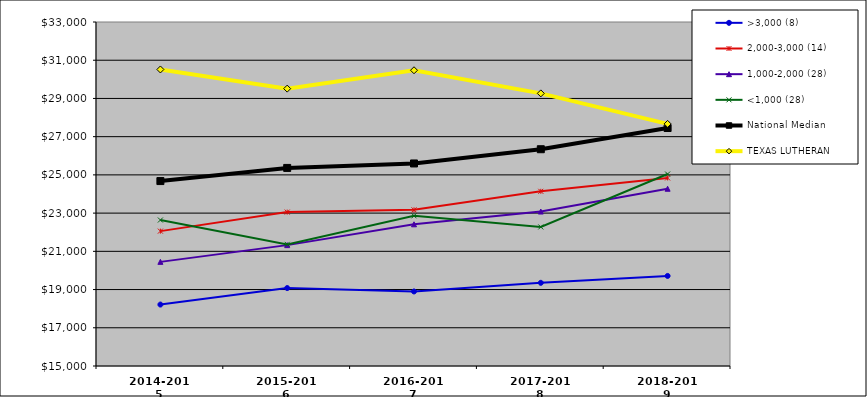
| Category | >3,000 (8) | 2,000-3,000 (14) | 1,000-2,000 (28) | <1,000 (28) | National Median | TEXAS LUTHERAN |
|---|---|---|---|---|---|---|
| 2014-2015 | 18214.818 | 22057.273 | 20448.636 | 22638.296 | 24676.206 | 30515.957 |
| 2015-2016 | 19078.293 | 23052.847 | 21324.654 | 21364.791 | 25364.205 | 29513.209 |
| 2016-2017 | 18900.339 | 23169.938 | 22414.336 | 22859.303 | 25597.574 | 30475.146 |
| 2017-2018 | 19352.239 | 24141.087 | 23082.886 | 22275.948 | 26342.841 | 29264.768 |
| 2018-2019 | 19712.619 | 24840.333 | 24274.36 | 25044.413 | 27452.913 | 27668.054 |